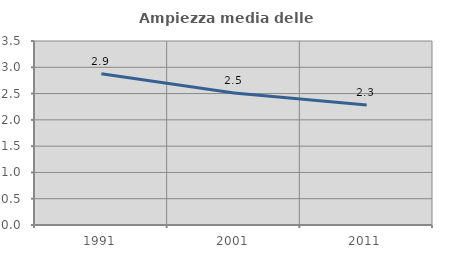
| Category | Ampiezza media delle famiglie |
|---|---|
| 1991.0 | 2.878 |
| 2001.0 | 2.511 |
| 2011.0 | 2.282 |